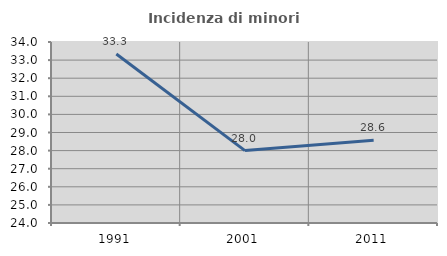
| Category | Incidenza di minori stranieri |
|---|---|
| 1991.0 | 33.333 |
| 2001.0 | 28 |
| 2011.0 | 28.571 |